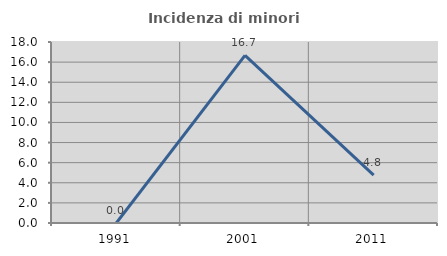
| Category | Incidenza di minori stranieri |
|---|---|
| 1991.0 | 0 |
| 2001.0 | 16.667 |
| 2011.0 | 4.762 |